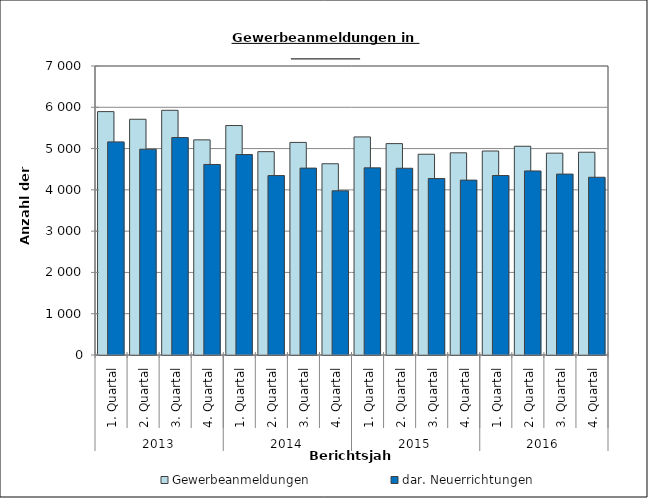
| Category | Gewerbeanmeldungen | dar. Neuerrichtungen |
|---|---|---|
| 0 | 5895 | 5162 |
| 1 | 5710 | 4985 |
| 2 | 5927 | 5267 |
| 3 | 5211 | 4615 |
| 4 | 5558 | 4856 |
| 5 | 4925 | 4346 |
| 6 | 5149 | 4527 |
| 7 | 4632 | 3977 |
| 8 | 5282 | 4533 |
| 9 | 5120 | 4523 |
| 10 | 4863 | 4274 |
| 11 | 4897 | 4236 |
| 12 | 4941 | 4347 |
| 13 | 5056 | 4458 |
| 14 | 4889 | 4382 |
| 15 | 4912 | 4305 |